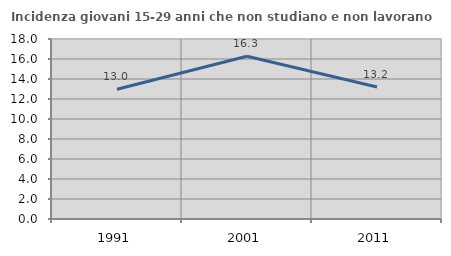
| Category | Incidenza giovani 15-29 anni che non studiano e non lavorano  |
|---|---|
| 1991.0 | 12.972 |
| 2001.0 | 16.267 |
| 2011.0 | 13.204 |